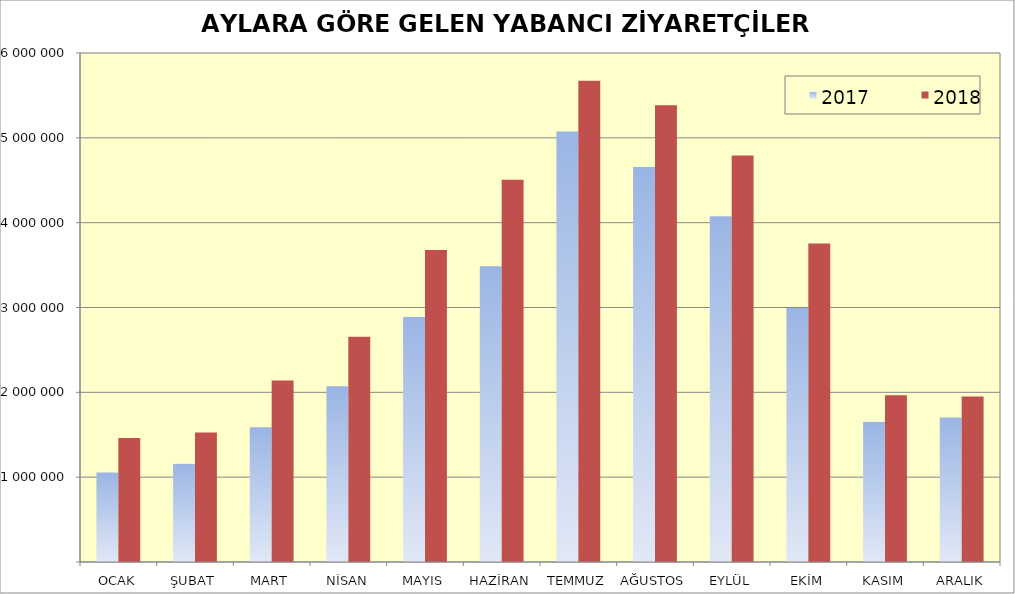
| Category | 2017 | 2018 |
|---|---|---|
| OCAK | 1055474 | 1461570 |
| ŞUBAT | 1159833 | 1527070 |
| MART | 1587007 | 2139766 |
| NİSAN | 2070322 | 2655561 |
| MAYIS | 2889873 | 3678440 |
| HAZİRAN | 3486940 | 4505594 |
| TEMMUZ | 5075961 | 5671801 |
| AĞUSTOS | 4658463 | 5383332 |
| EYLÜL | 4076630 | 4792818 |
| EKİM | 2992947 | 3755467 |
| KASIM | 1652795 | 1966277 |
| ARALIK | 1703789 | 1950705 |